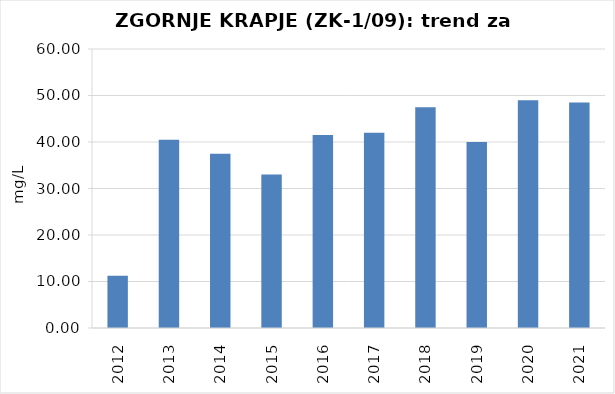
| Category | Vsota |
|---|---|
| 2012 | 11.25 |
| 2013 | 40.5 |
| 2014 | 37.5 |
| 2015 | 33 |
| 2016 | 41.5 |
| 2017 | 42 |
| 2018 | 47.5 |
| 2019 | 40 |
| 2020 | 49 |
| 2021 | 48.5 |